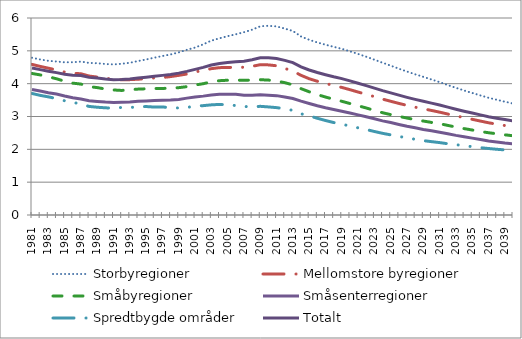
| Category | Storbyregioner | Mellomstore byregioner | Småbyregioner | Småsenterregioner | Spredtbygde områder | Totalt |
|---|---|---|---|---|---|---|
| 1981.0 | 4.79 | 4.587 | 4.31 | 3.82 | 3.701 | 4.48 |
| 1982.0 | 4.737 | 4.526 | 4.267 | 3.775 | 3.644 | 4.427 |
| 1983.0 | 4.696 | 4.472 | 4.21 | 3.721 | 3.599 | 4.378 |
| 1984.0 | 4.675 | 4.416 | 4.15 | 3.685 | 3.546 | 4.337 |
| 1985.0 | 4.651 | 4.354 | 4.073 | 3.623 | 3.479 | 4.286 |
| 1986.0 | 4.652 | 4.316 | 4.016 | 3.572 | 3.432 | 4.258 |
| 1987.0 | 4.673 | 4.302 | 3.988 | 3.532 | 3.379 | 4.249 |
| 1988.0 | 4.632 | 4.233 | 3.91 | 3.482 | 3.307 | 4.192 |
| 1989.0 | 4.622 | 4.2 | 3.88 | 3.458 | 3.282 | 4.17 |
| 1990.0 | 4.599 | 4.165 | 3.836 | 3.439 | 3.265 | 4.141 |
| 1991.0 | 4.585 | 4.136 | 3.808 | 3.426 | 3.253 | 4.121 |
| 1992.0 | 4.607 | 4.119 | 3.794 | 3.434 | 3.276 | 4.124 |
| 1993.0 | 4.636 | 4.123 | 3.815 | 3.443 | 3.276 | 4.142 |
| 1994.0 | 4.689 | 4.135 | 3.834 | 3.462 | 3.29 | 4.171 |
| 1995.0 | 4.737 | 4.153 | 3.844 | 3.474 | 3.303 | 4.198 |
| 1996.0 | 4.791 | 4.176 | 3.852 | 3.485 | 3.287 | 4.228 |
| 1997.0 | 4.841 | 4.187 | 3.855 | 3.496 | 3.293 | 4.252 |
| 1998.0 | 4.89 | 4.216 | 3.863 | 3.5 | 3.262 | 4.281 |
| 1999.0 | 4.953 | 4.253 | 3.878 | 3.52 | 3.262 | 4.321 |
| 2000.0 | 5.031 | 4.294 | 3.909 | 3.56 | 3.274 | 4.374 |
| 2001.0 | 5.099 | 4.359 | 3.958 | 3.596 | 3.321 | 4.434 |
| 2002.0 | 5.198 | 4.401 | 3.998 | 3.62 | 3.331 | 4.495 |
| 2003.0 | 5.311 | 4.457 | 4.058 | 3.653 | 3.355 | 4.569 |
| 2004.0 | 5.383 | 4.488 | 4.091 | 3.676 | 3.368 | 4.614 |
| 2005.0 | 5.447 | 4.494 | 4.105 | 3.681 | 3.356 | 4.643 |
| 2006.0 | 5.504 | 4.495 | 4.108 | 3.675 | 3.334 | 4.665 |
| 2007.0 | 5.568 | 4.5 | 4.101 | 3.644 | 3.307 | 4.686 |
| 2008.0 | 5.643 | 4.528 | 4.111 | 3.644 | 3.29 | 4.726 |
| 2009.0 | 5.748 | 4.578 | 4.12 | 3.662 | 3.31 | 4.786 |
| 2010.0 | 5.763 | 4.572 | 4.11 | 3.65 | 3.291 | 4.788 |
| 2011.0 | 5.743 | 4.545 | 4.081 | 3.635 | 3.27 | 4.769 |
| 2012.0 | 5.678 | 4.465 | 4.031 | 3.592 | 3.237 | 4.709 |
| 2013.0 | 5.604 | 4.383 | 3.962 | 3.547 | 3.185 | 4.641 |
| 2014.0 | 5.438 | 4.255 | 3.848 | 3.467 | 3.082 | 4.511 |
| 2015.0 | 5.336 | 4.15 | 3.753 | 3.396 | 3.02 | 4.416 |
| 2016.0 | 5.254 | 4.073 | 3.667 | 3.326 | 2.946 | 4.338 |
| 2017.0 | 5.186 | 4.009 | 3.593 | 3.267 | 2.878 | 4.273 |
| 2018.0 | 5.121 | 3.942 | 3.524 | 3.215 | 2.816 | 4.209 |
| 2019.0 | 5.062 | 3.886 | 3.463 | 3.159 | 2.767 | 4.153 |
| 2020.0 | 4.985 | 3.817 | 3.395 | 3.104 | 2.708 | 4.084 |
| 2021.0 | 4.905 | 3.745 | 3.327 | 3.05 | 2.655 | 4.014 |
| 2022.0 | 4.82 | 3.674 | 3.26 | 2.992 | 2.603 | 3.942 |
| 2023.0 | 4.729 | 3.604 | 3.185 | 2.93 | 2.543 | 3.866 |
| 2024.0 | 4.638 | 3.53 | 3.115 | 2.866 | 2.488 | 3.789 |
| 2025.0 | 4.549 | 3.463 | 3.057 | 2.815 | 2.44 | 3.72 |
| 2026.0 | 4.456 | 3.399 | 3.004 | 2.759 | 2.394 | 3.649 |
| 2027.0 | 4.369 | 3.338 | 2.952 | 2.702 | 2.35 | 3.583 |
| 2028.0 | 4.285 | 3.284 | 2.906 | 2.656 | 2.305 | 3.522 |
| 2029.0 | 4.208 | 3.233 | 2.862 | 2.607 | 2.266 | 3.464 |
| 2030.0 | 4.128 | 3.185 | 2.82 | 2.564 | 2.235 | 3.408 |
| 2031.0 | 4.046 | 3.132 | 2.781 | 2.52 | 2.205 | 3.35 |
| 2032.0 | 3.957 | 3.075 | 2.729 | 2.473 | 2.17 | 3.285 |
| 2033.0 | 3.873 | 3.02 | 2.679 | 2.425 | 2.14 | 3.222 |
| 2034.0 | 3.791 | 2.966 | 2.631 | 2.382 | 2.115 | 3.162 |
| 2035.0 | 3.717 | 2.914 | 2.588 | 2.341 | 2.08 | 3.106 |
| 2036.0 | 3.642 | 2.861 | 2.544 | 2.299 | 2.05 | 3.049 |
| 2037.0 | 3.57 | 2.809 | 2.506 | 2.255 | 2.025 | 2.994 |
| 2038.0 | 3.51 | 2.767 | 2.474 | 2.223 | 2.002 | 2.949 |
| 2039.0 | 3.45 | 2.725 | 2.442 | 2.193 | 1.983 | 2.906 |
| 2040.0 | 3.396 | 2.687 | 2.413 | 2.169 | 1.968 | 2.866 |